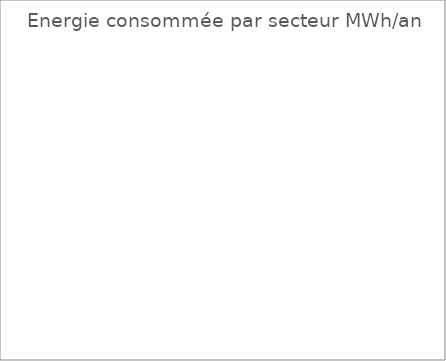
| Category | Energie totale consommée | Energie totale injectée |
|---|---|---|
| Résidentiel | 0 | 0 |
| Tertiaire | 0 | 0 |
| Industrie | 0 | 0 |